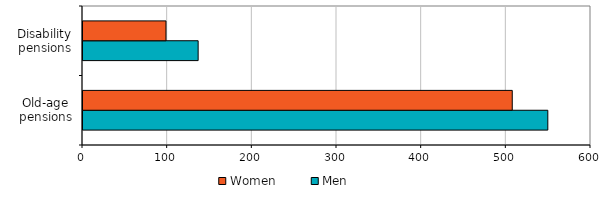
| Category | Men | Women |
|---|---|---|
| Old-age
pensions | 549 | 507 |
| Disability pensions | 136 | 98 |